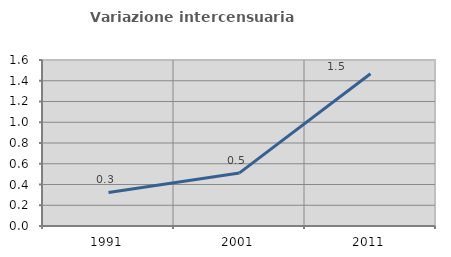
| Category | Variazione intercensuaria annua |
|---|---|
| 1991.0 | 0.324 |
| 2001.0 | 0.512 |
| 2011.0 | 1.467 |